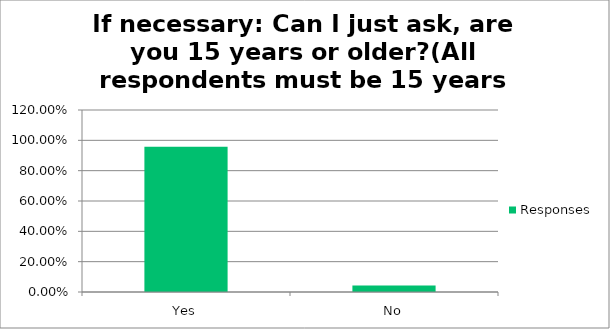
| Category | Responses |
|---|---|
| Yes | 0.957 |
| No | 0.043 |